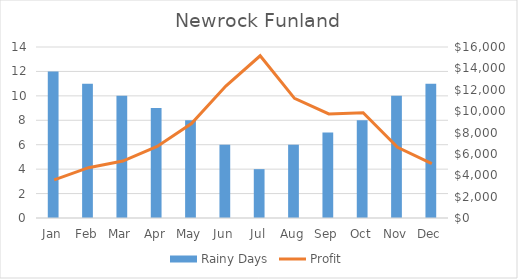
| Category | Rainy Days |
|---|---|
| Jan | 12 |
| Feb | 11 |
| Mar | 10 |
| Apr | 9 |
| May | 8 |
| Jun | 6 |
| Jul | 4 |
| Aug | 6 |
| Sep | 7 |
| Oct | 8 |
| Nov | 10 |
| Dec | 11 |